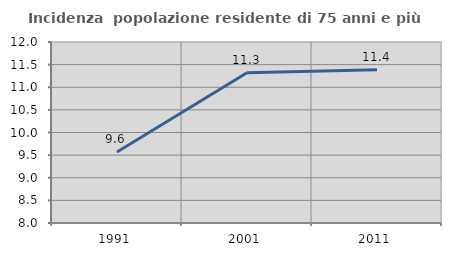
| Category | Incidenza  popolazione residente di 75 anni e più |
|---|---|
| 1991.0 | 9.568 |
| 2001.0 | 11.319 |
| 2011.0 | 11.385 |